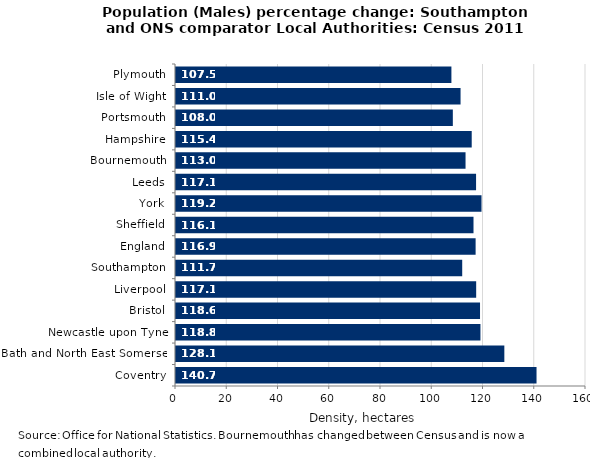
| Category | Percentage change |
|---|---|
| Coventry | 140.696 |
| Bath and North East Somerset | 128.131 |
| Newcastle upon Tyne | 118.807 |
| Bristol | 118.644 |
| Liverpool | 117.141 |
| Southampton | 111.692 |
| England | 116.924 |
| Sheffield | 116.098 |
| York | 119.224 |
| Leeds | 117.1 |
| Bournemouth | 112.992 |
| Hampshire | 115.401 |
| Portsmouth | 108.033 |
| Isle of Wight | 111.047 |
| Plymouth | 107.476 |